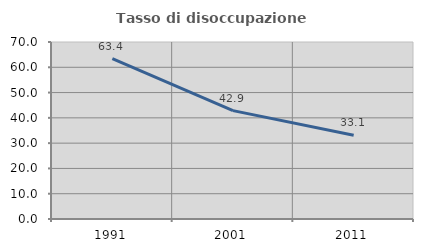
| Category | Tasso di disoccupazione giovanile  |
|---|---|
| 1991.0 | 63.415 |
| 2001.0 | 42.857 |
| 2011.0 | 33.117 |